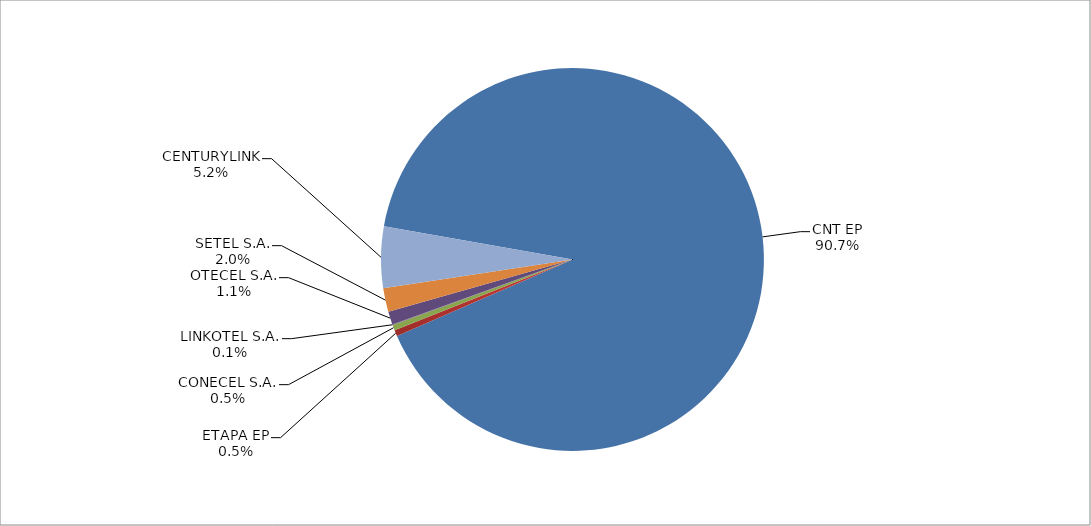
| Category | Series 0 |
|---|---|
| CNT EP | 2956 |
| ETAPA EP | 17 |
| CONECEL S.A. | 15 |
| LINKOTEL S.A. | 2 |
| OTECEL S.A. | 36 |
| SETEL S.A. | 65 |
| CENTURYLINK | 169 |